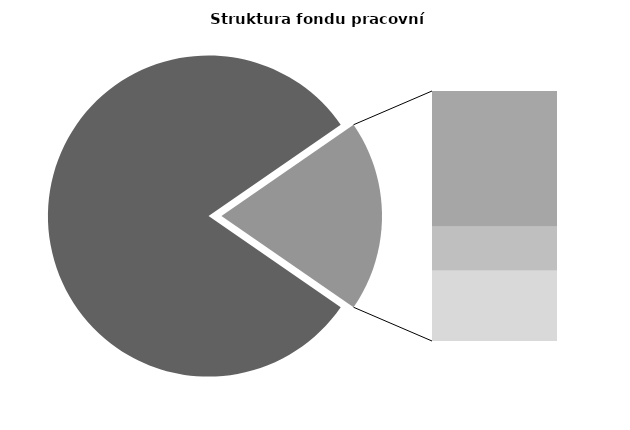
| Category | Series 0 |
|---|---|
| Průměrná měsíční odpracovaná doba bez přesčasu | 138.764 |
| Dovolená | 17.954 |
| Nemoc | 5.831 |
| Jiné | 9.273 |